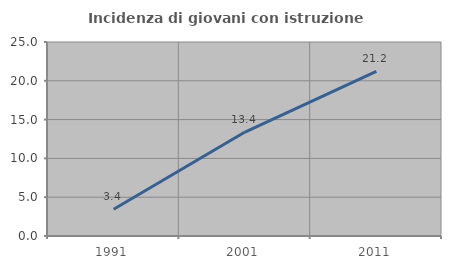
| Category | Incidenza di giovani con istruzione universitaria |
|---|---|
| 1991.0 | 3.448 |
| 2001.0 | 13.393 |
| 2011.0 | 21.212 |